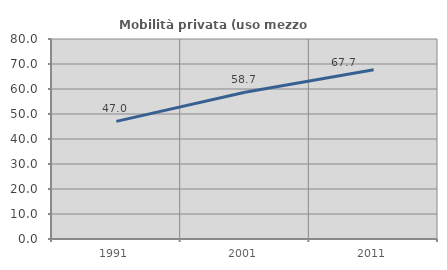
| Category | Mobilità privata (uso mezzo privato) |
|---|---|
| 1991.0 | 47.042 |
| 2001.0 | 58.693 |
| 2011.0 | 67.72 |